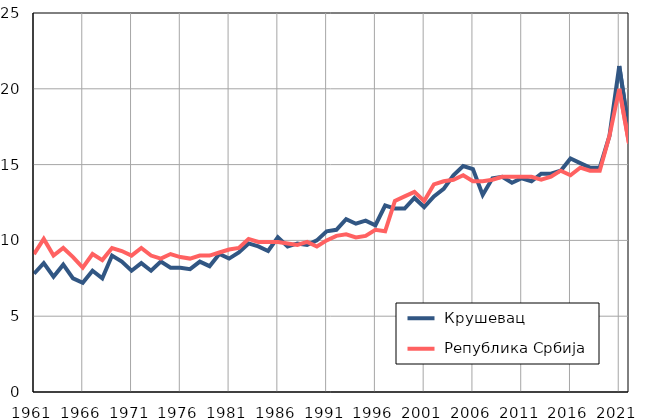
| Category |  Крушевац |  Република Србија |
|---|---|---|
| 1961.0 | 7.8 | 9.1 |
| 1962.0 | 8.5 | 10.1 |
| 1963.0 | 7.6 | 9 |
| 1964.0 | 8.4 | 9.5 |
| 1965.0 | 7.5 | 8.9 |
| 1966.0 | 7.2 | 8.2 |
| 1967.0 | 8 | 9.1 |
| 1968.0 | 7.5 | 8.7 |
| 1969.0 | 9 | 9.5 |
| 1970.0 | 8.6 | 9.3 |
| 1971.0 | 8 | 9 |
| 1972.0 | 8.5 | 9.5 |
| 1973.0 | 8 | 9 |
| 1974.0 | 8.6 | 8.8 |
| 1975.0 | 8.2 | 9.1 |
| 1976.0 | 8.2 | 8.9 |
| 1977.0 | 8.1 | 8.8 |
| 1978.0 | 8.6 | 9 |
| 1979.0 | 8.3 | 9 |
| 1980.0 | 9.1 | 9.2 |
| 1981.0 | 8.8 | 9.4 |
| 1982.0 | 9.2 | 9.5 |
| 1983.0 | 9.8 | 10.1 |
| 1984.0 | 9.6 | 9.9 |
| 1985.0 | 9.3 | 9.9 |
| 1986.0 | 10.2 | 9.9 |
| 1987.0 | 9.6 | 9.8 |
| 1988.0 | 9.8 | 9.7 |
| 1989.0 | 9.7 | 9.9 |
| 1990.0 | 10 | 9.6 |
| 1991.0 | 10.6 | 10 |
| 1992.0 | 10.7 | 10.3 |
| 1993.0 | 11.4 | 10.4 |
| 1994.0 | 11.1 | 10.2 |
| 1995.0 | 11.3 | 10.3 |
| 1996.0 | 11 | 10.7 |
| 1997.0 | 12.3 | 10.6 |
| 1998.0 | 12.1 | 12.6 |
| 1999.0 | 12.1 | 12.9 |
| 2000.0 | 12.8 | 13.2 |
| 2001.0 | 12.2 | 12.6 |
| 2002.0 | 12.9 | 13.7 |
| 2003.0 | 13.4 | 13.9 |
| 2004.0 | 14.3 | 14 |
| 2005.0 | 14.9 | 14.3 |
| 2006.0 | 14.7 | 13.9 |
| 2007.0 | 13 | 13.9 |
| 2008.0 | 14.1 | 14 |
| 2009.0 | 14.2 | 14.2 |
| 2010.0 | 13.8 | 14.2 |
| 2011.0 | 14.1 | 14.2 |
| 2012.0 | 13.9 | 14.2 |
| 2013.0 | 14.4 | 14 |
| 2014.0 | 14.4 | 14.2 |
| 2015.0 | 14.6 | 14.6 |
| 2016.0 | 15.4 | 14.3 |
| 2017.0 | 15.1 | 14.8 |
| 2018.0 | 14.8 | 14.6 |
| 2019.0 | 14.8 | 14.6 |
| 2020.0 | 16.9 | 16.9 |
| 2021.0 | 21.5 | 20 |
| 2022.0 | 17.2 | 16.4 |